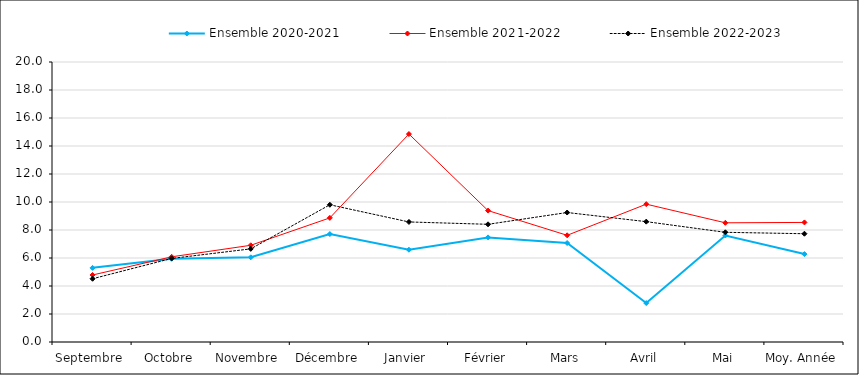
| Category | Ensemble |
|---|---|
| Septembre | 4.517 |
| Octobre | 5.969 |
| Novembre | 6.652 |
| Décembre | 9.802 |
| Janvier | 8.575 |
| Février | 8.407 |
| Mars | 9.249 |
| Avril | 8.596 |
| Mai | 7.835 |
| Moy. Année | 7.734 |